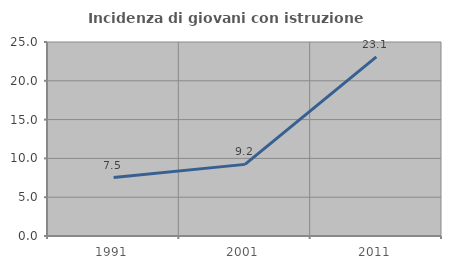
| Category | Incidenza di giovani con istruzione universitaria |
|---|---|
| 1991.0 | 7.527 |
| 2001.0 | 9.231 |
| 2011.0 | 23.077 |